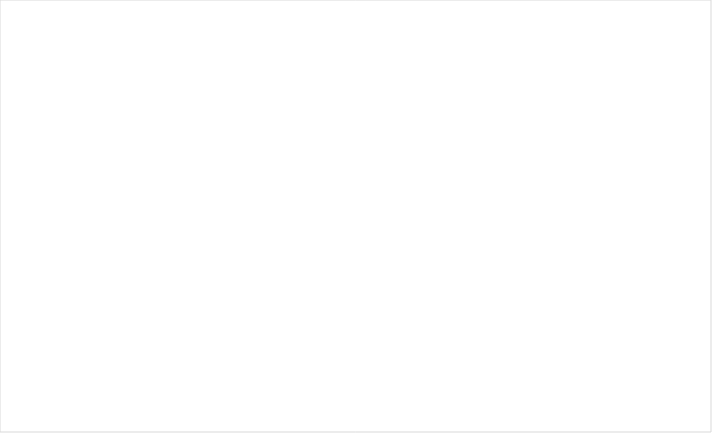
| Category | 236115X - Single-family residential construction - Labor productivity - 2007=100 | 236115X - Single-family residential construction - Output - 2007=100 | 236115X - Single-family residential construction - Hours worked - 2007=100 |
|---|---|---|---|
| 2007 | 100 | 100 | 100 |
| 2008 | 81.513 | 66.013 | 80.985 |
| 2009 | 66.567 | 42.634 | 64.046 |
| 2010 | 80.413 | 45.123 | 56.114 |
| 2011 | 82.775 | 43.294 | 52.303 |
| 2012 | 99.157 | 50.63 | 51.06 |
| 2013 | 106.739 | 58.888 | 55.17 |
| 2014 | 99.663 | 60.737 | 60.943 |
| 2015 | 102.389 | 65.307 | 63.783 |
| 2016 | 99.115 | 66.557 | 67.152 |
| 2017 | 97.547 | 68.985 | 70.719 |
| 2018 | 92.929 | 70.831 | 76.22 |
| 2019 | 85.594 | 66.487 | 77.677 |
| 2020 | 95.577 | 70.86 | 74.14 |